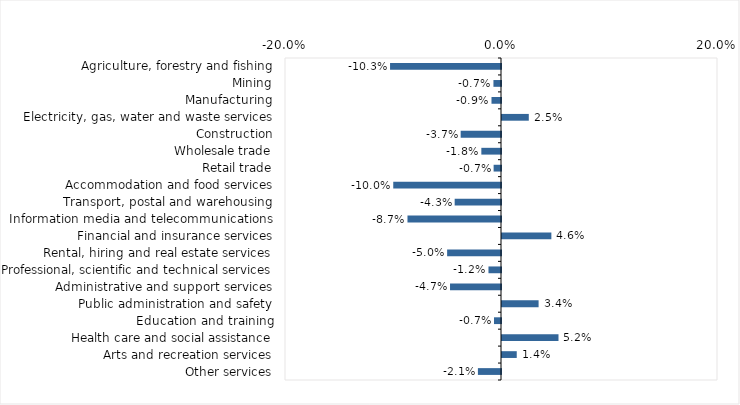
| Category | This week |
|---|---|
| Agriculture, forestry and fishing | -0.103 |
| Mining | -0.007 |
| Manufacturing | -0.009 |
| Electricity, gas, water and waste services | 0.025 |
| Construction | -0.037 |
| Wholesale trade | -0.018 |
| Retail trade | -0.007 |
| Accommodation and food services | -0.1 |
| Transport, postal and warehousing | -0.043 |
| Information media and telecommunications | -0.087 |
| Financial and insurance services | 0.046 |
| Rental, hiring and real estate services | -0.05 |
| Professional, scientific and technical services | -0.012 |
| Administrative and support services | -0.047 |
| Public administration and safety | 0.034 |
| Education and training | -0.007 |
| Health care and social assistance | 0.052 |
| Arts and recreation services | 0.014 |
| Other services | -0.021 |